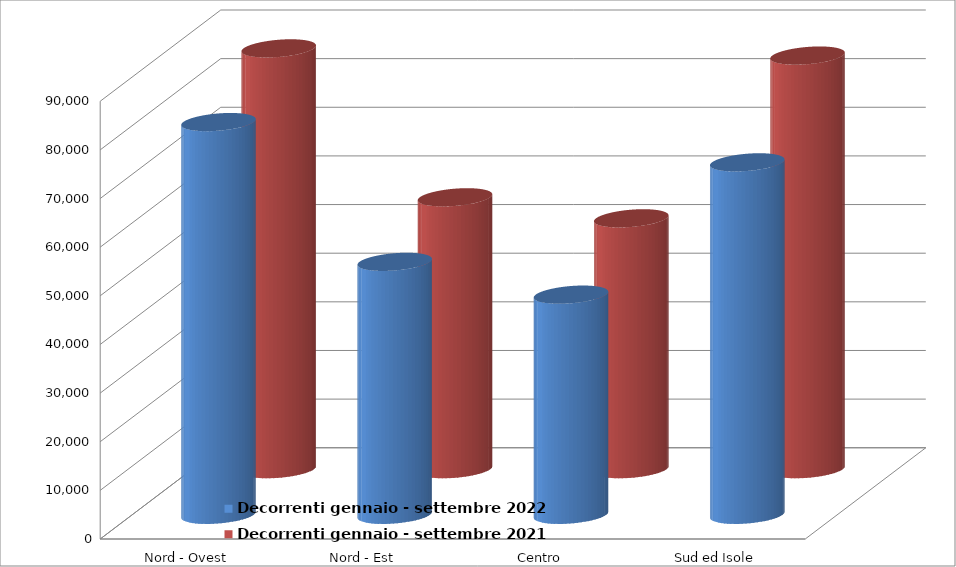
| Category | Decorrenti gennaio - settembre 2022 | Decorrenti gennaio - settembre 2021 |
|---|---|---|
| Nord - Ovest | 80745 | 86516 |
| Nord - Est | 52008 | 55899 |
| Centro | 45265 | 51578 |
| Sud ed Isole | 72466 | 85039 |